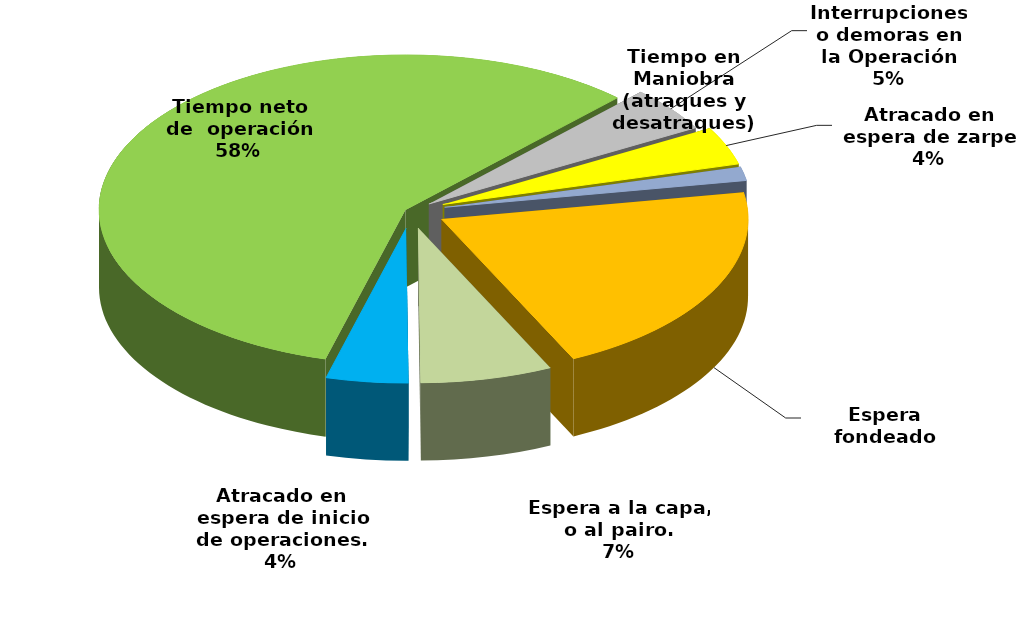
| Category | Series 0 |
|---|---|
| Espera fondeado | 32002.783 |
| Espera a la capa, o al pairo. | 10751.917 |
| Atracado en espera de inicio de operaciones. | 6691.214 |
| Tiempo neto de  operación | 89582.588 |
| Interrupciones o demoras en la Operación | 7207.1 |
| Atracado en espera de zarpe | 6149.579 |
| Tiempo en Maniobra (atraques y desatraques) | 2240.7 |